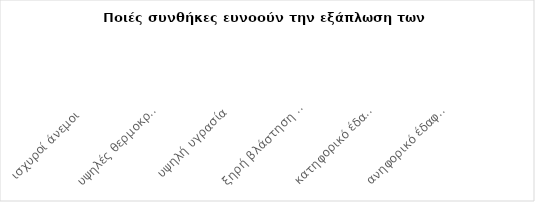
| Category | Field3 |
|---|---|
| ισχυροί άνεμοι  | 0 |
| υψηλές θερμοκρασίες  | 0 |
| υψηλή υγρασία | 0 |
| ξηρή βλάστηση (χόρτα, δέντρα, θάμνοι) | 0 |
| κατηφορικό έδαφος | 0 |
| ανηφορικό έδαφος | 0 |